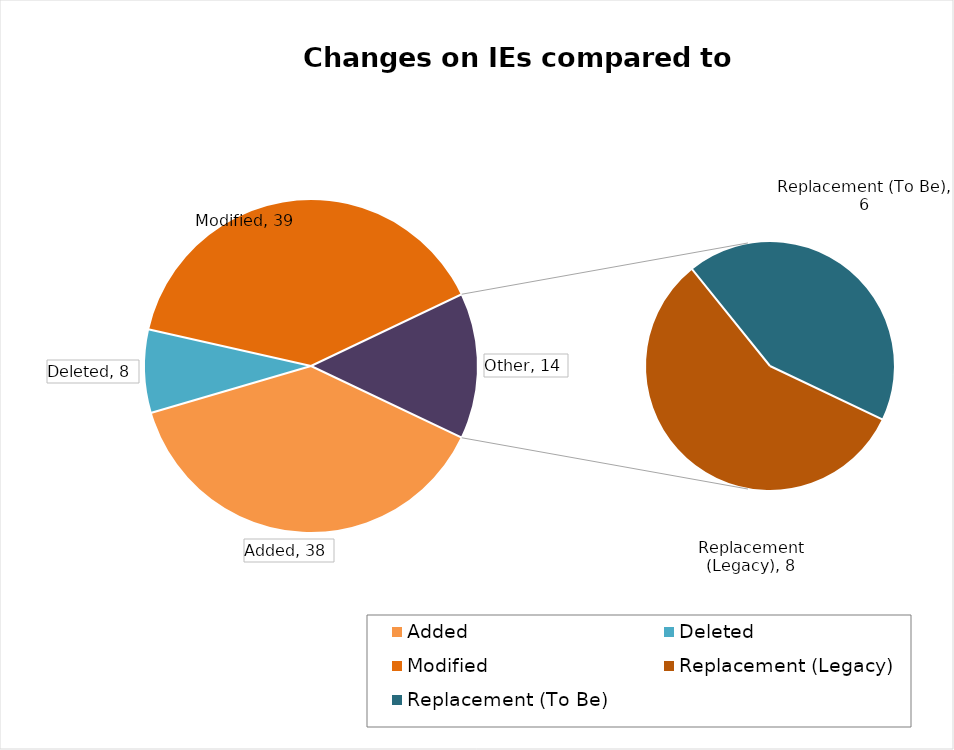
| Category | Total |
|---|---|
| Added | 38 |
| Deleted | 8 |
| Modified | 39 |
| Replacement (Legacy) | 8 |
| Replacement (To Be) | 6 |